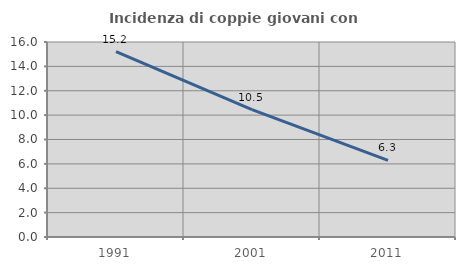
| Category | Incidenza di coppie giovani con figli |
|---|---|
| 1991.0 | 15.219 |
| 2001.0 | 10.452 |
| 2011.0 | 6.285 |